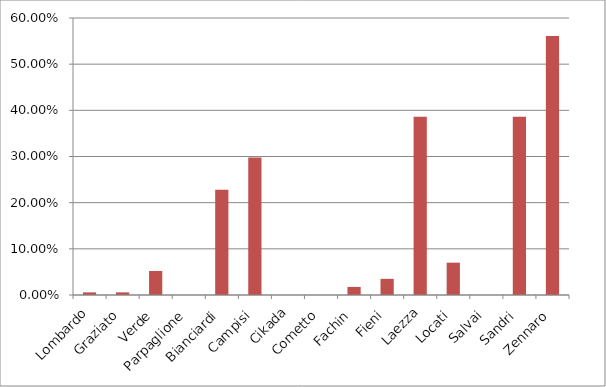
| Category | Series 0 |
|---|---|
| Lombardo | 0.006 |
| Graziato | 0.006 |
| Verde | 0.052 |
| Parpaglione | 0 |
| Bianciardi | 0.228 |
| Campisi | 0.298 |
| Cikada | 0 |
| Cometto | 0 |
| Fachin | 0.018 |
| Fieni | 0.035 |
| Laezza | 0.386 |
| Locati | 0.07 |
| Salvai | 0 |
| Sandri | 0.386 |
| Zennaro | 0.561 |